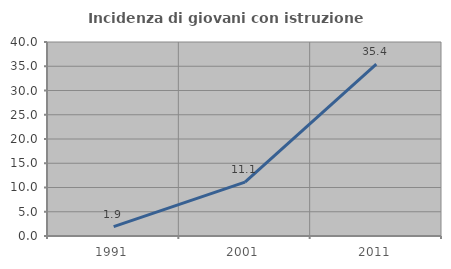
| Category | Incidenza di giovani con istruzione universitaria |
|---|---|
| 1991.0 | 1.942 |
| 2001.0 | 11.111 |
| 2011.0 | 35.417 |